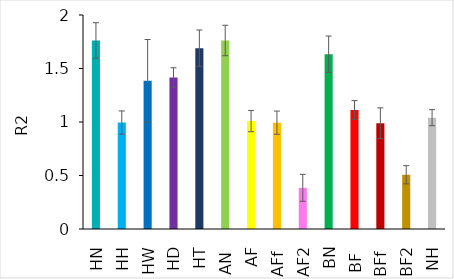
| Category | Average R2 |
|---|---|
| HN | 1.762 |
| HH | 0.995 |
| HW | 1.386 |
| HD | 1.416 |
| HT | 1.69 |
| AN  | 1.762 |
| AF | 1.009 |
| AFf  | 0.994 |
| AF2 | 0.385 |
| BN | 1.634 |
| BF  | 1.112 |
| BFf  | 0.989 |
| BF2 | 0.507 |
| NH | 1.041 |